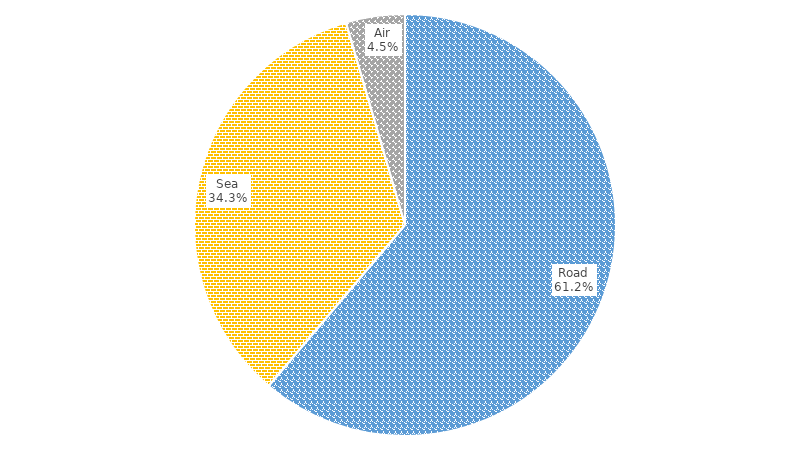
| Category | Series 0 | Series 1 |
|---|---|---|
| Road | 5881.947 | 0.612 |
| Sea | 3297 | 0.343 |
| Air | 434.609 | 0.045 |